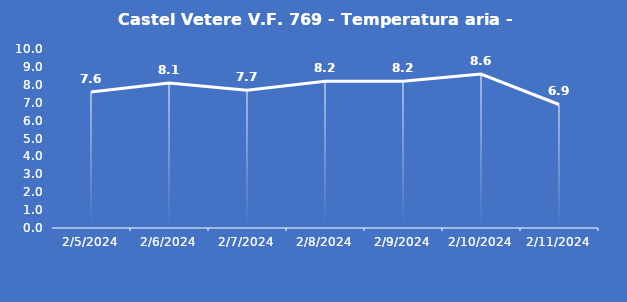
| Category | Castel Vetere V.F. 769 - Temperatura aria - Grezzo (°C) |
|---|---|
| 2/5/24 | 7.6 |
| 2/6/24 | 8.1 |
| 2/7/24 | 7.7 |
| 2/8/24 | 8.2 |
| 2/9/24 | 8.2 |
| 2/10/24 | 8.6 |
| 2/11/24 | 6.9 |